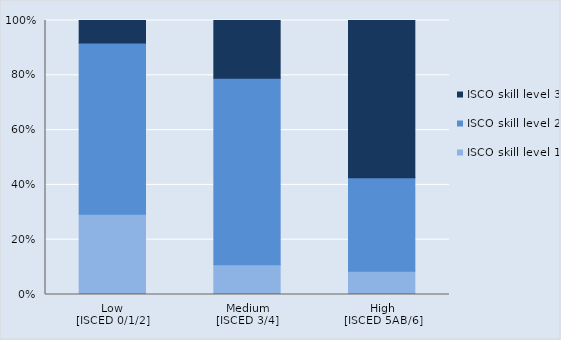
| Category | ISCO skill level 1 | ISCO skill level 2 | ISCO skill level 3 |
|---|---|---|---|
| Low
[ISCED 0/1/2] | 135984 | 290617 | 38218 |
| Medium
[ISCED 3/4] | 28887 | 181107 | 56122 |
| High
[ISCED 5AB/6] | 9946 | 39939 | 67086 |